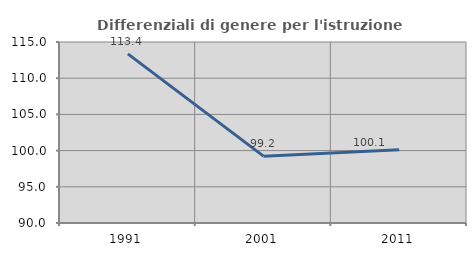
| Category | Differenziali di genere per l'istruzione superiore |
|---|---|
| 1991.0 | 113.36 |
| 2001.0 | 99.237 |
| 2011.0 | 100.108 |